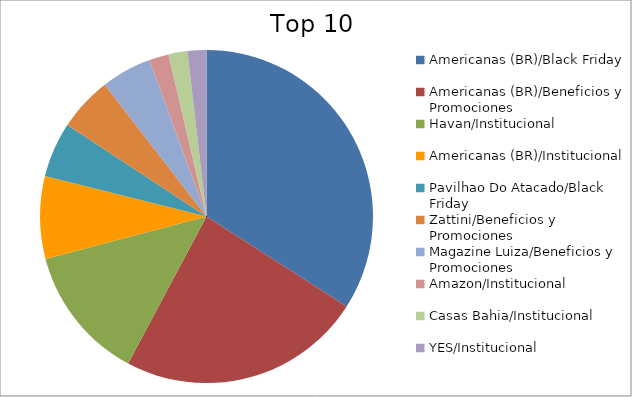
| Category | Series 0 |
|---|---|
| Americanas (BR)/Black Friday | 32.54 |
| Americanas (BR)/Beneficios y Promociones | 22.65 |
| Havan/Institucional | 12.49 |
| Americanas (BR)/Institucional | 7.66 |
| Pavilhao Do Atacado/Black Friday | 5.1 |
| Zattini/Beneficios y Promociones | 5.05 |
| Magazine Luiza/Beneficios y Promociones | 4.68 |
| Amazon/Institucional | 1.81 |
| Casas Bahia/Institucional | 1.75 |
| YES/Institucional | 1.75 |